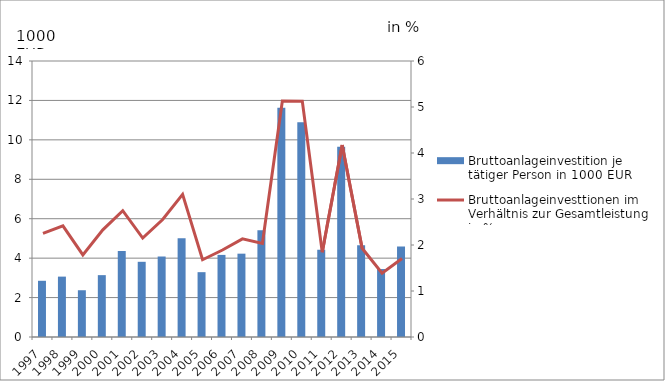
| Category | Bruttoanlageinvestition je tätiger Person in 1000 EUR |
|---|---|
| 1997.0 | 2.851 |
| 1998.0 | 3.063 |
| 1999.0 | 2.372 |
| 2000.0 | 3.138 |
| 2001.0 | 4.367 |
| 2002.0 | 3.814 |
| 2003.0 | 4.083 |
| 2004.0 | 5.015 |
| 2005.0 | 3.288 |
| 2006.0 | 4.165 |
| 2007.0 | 4.227 |
| 2008.0 | 5.419 |
| 2009.0 | 11.626 |
| 2010.0 | 10.891 |
| 2011.0 | 4.427 |
| 2012.0 | 9.648 |
| 2013.0 | 4.651 |
| 2014.0 | 3.447 |
| 2015.0 | 4.586 |